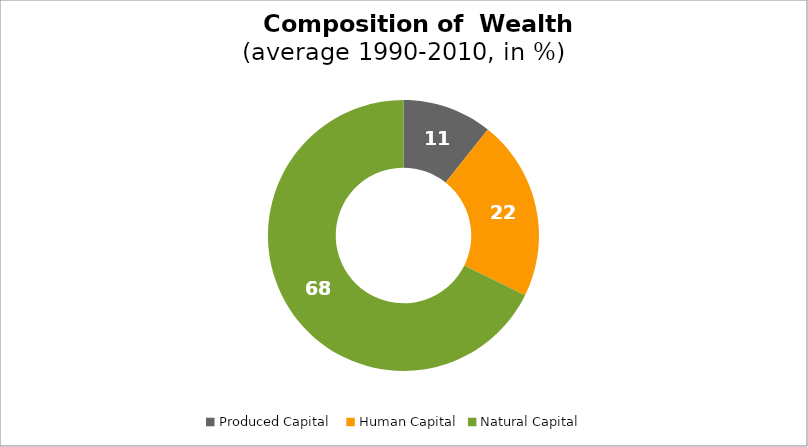
| Category | Series 0 |
|---|---|
| Produced Capital  | 10.682 |
| Human Capital | 21.594 |
| Natural Capital | 67.725 |